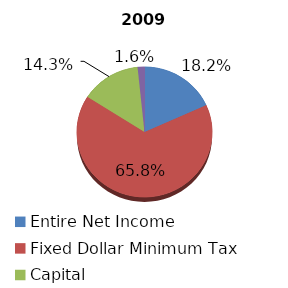
| Category | 2009 |
|---|---|
| Entire Net Income | 47767 |
| Fixed Dollar Minimum Tax | 172546 |
| Capital | 37487 |
| Alternative Minimum Taxable Income | 4277 |